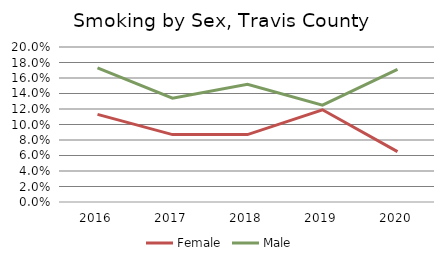
| Category | Female | Male |
|---|---|---|
| 2016.0 | 0.113 | 0.173 |
| 2017.0 | 0.087 | 0.134 |
| 2018.0 | 0.087 | 0.152 |
| 2019.0 | 0.119 | 0.125 |
| 2020.0 | 0.065 | 0.171 |